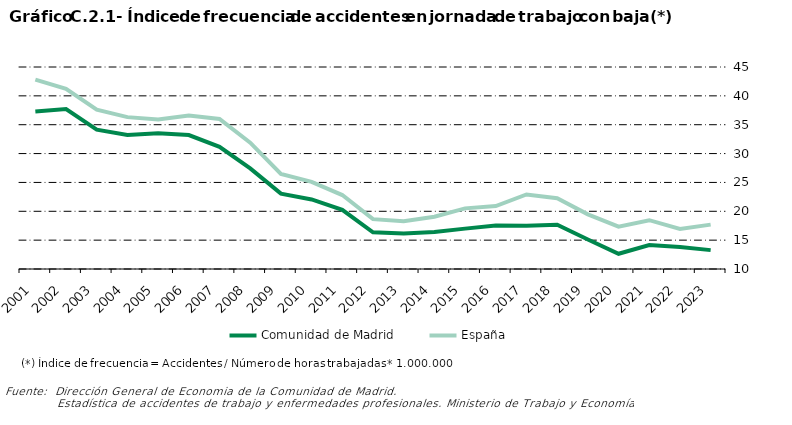
| Category | Comunidad de Madrid | España |
|---|---|---|
| 2001.0 | 37.291 | 42.8 |
| 2002.0 | 37.712 | 41.206 |
| 2003.0 | 34.147 | 37.623 |
| 2004.0 | 33.21 | 36.316 |
| 2005.0 | 33.504 | 35.912 |
| 2006.0 | 33.2 | 36.6 |
| 2007.0 | 31.174 | 36 |
| 2008.0 | 27.424 | 31.89 |
| 2009.0 | 23.054 | 26.468 |
| 2010.0 | 22.047 | 25.109 |
| 2011.0 | 20.248 | 22.814 |
| 2012.0 | 16.367 | 18.642 |
| 2013.0 | 16.134 | 18.296 |
| 2014.0 | 16.398 | 19.061 |
| 2015.0 | 16.996 | 20.506 |
| 2016.0 | 17.553 | 20.901 |
| 2017.0 | 17.514 | 22.915 |
| 2018.0 | 17.676 | 22.27 |
| 2019.0 | 15.107 | 19.472 |
| 2020.0 | 12.642 | 17.334 |
| 2021.0 | 14.136 | 18.457 |
| 2022.0 | 13.809 | 16.943 |
| 2023.0 | 13.269 | 17.688 |